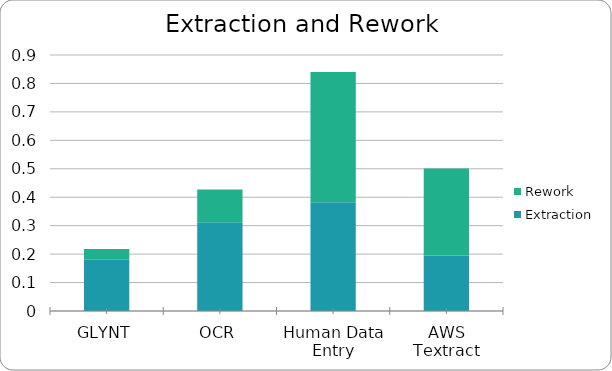
| Category | Extraction | Rework |
|---|---|---|
| GLYNT | 0.18 | 0.038 |
| OCR | 0.312 | 0.115 |
| Human Data Entry | 0.382 | 0.458 |
| AWS Textract | 0.195 | 0.306 |